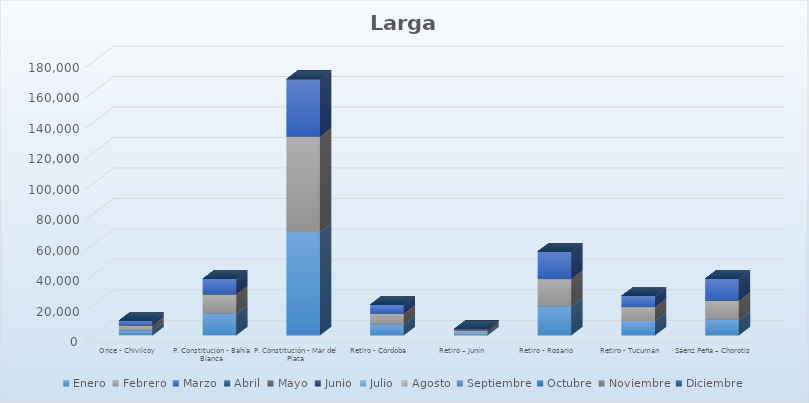
| Category | Enero | Febrero | Marzo | Abril | Mayo | Junio | Julio | Agosto | Septiembre | Octubre | Noviembre | Diciembre |
|---|---|---|---|---|---|---|---|---|---|---|---|---|
| Once - Chivilcoy | 3109 | 3338 | 3246 | 0 | 0 | 0 | 0 | 0 | 0 | 0 | 0 | 0 |
| P. Constitución - Bahía Blanca | 14340 | 12456 | 10348 | 0 | 0 | 0 | 0 | 0 | 0 | 0 | 0 | 0 |
| P. Constitución - Mar del Plata | 67967 | 62481 | 37666 | 0 | 0 | 0 | 0 | 0 | 0 | 0 | 0 | 0 |
| Retiro - Córdoba | 7066 | 7013 | 6100 | 0 | 0 | 0 | 0 | 0 | 0 | 0 | 0 | 0 |
| Retiro – Junín | 1432 | 1605 | 1054 | 0 | 0 | 0 | 0 | 0 | 0 | 0 | 0 | 0 |
| Retiro - Rosario | 19022 | 17925 | 18135 | 0 | 0 | 0 | 0 | 0 | 0 | 0 | 0 | 0 |
| Retiro - Tucumán | 9299 | 9285 | 7268 | 0 | 0 | 0 | 0 | 0 | 0 | 0 | 0 | 0 |
| Sáenz Peña – Chorotis | 10322 | 12241 | 14754 | 0 | 0 | 0 | 0 | 0 | 0 | 0 | 0 | 0 |